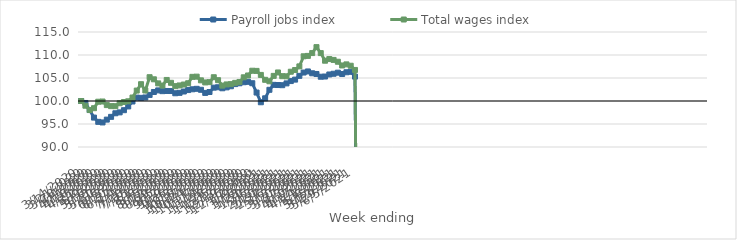
| Category | Payroll jobs index | Total wages index |
|---|---|---|
| 14/03/2020 | 100 | 100 |
| 21/03/2020 | 99.571 | 98.977 |
| 28/03/2020 | 98.032 | 98.042 |
| 04/04/2020 | 96.395 | 98.437 |
| 11/04/2020 | 95.466 | 99.841 |
| 18/04/2020 | 95.337 | 99.891 |
| 25/04/2020 | 95.953 | 99.109 |
| 02/05/2020 | 96.553 | 98.884 |
| 09/05/2020 | 97.332 | 98.873 |
| 16/05/2020 | 97.524 | 99.514 |
| 23/05/2020 | 98.001 | 99.779 |
| 30/05/2020 | 98.82 | 99.934 |
| 06/06/2020 | 99.892 | 100.753 |
| 13/06/2020 | 100.737 | 102.268 |
| 20/06/2020 | 100.685 | 103.652 |
| 27/06/2020 | 100.768 | 102.291 |
| 04/07/2020 | 101.321 | 105.174 |
| 11/07/2020 | 101.957 | 104.716 |
| 18/07/2020 | 102.306 | 103.83 |
| 25/07/2020 | 102.138 | 103.357 |
| 01/08/2020 | 102.18 | 104.576 |
| 08/08/2020 | 102.169 | 103.954 |
| 15/08/2020 | 101.684 | 103.229 |
| 22/08/2020 | 101.771 | 103.381 |
| 29/08/2020 | 102.063 | 103.578 |
| 05/09/2020 | 102.375 | 103.861 |
| 12/09/2020 | 102.547 | 105.249 |
| 19/09/2020 | 102.649 | 105.292 |
| 26/09/2020 | 102.437 | 104.492 |
| 03/10/2020 | 101.757 | 104.038 |
| 10/10/2020 | 101.956 | 104.103 |
| 17/10/2020 | 102.901 | 105.169 |
| 24/10/2020 | 102.989 | 104.528 |
| 31/10/2020 | 102.766 | 103.341 |
| 07/11/2020 | 102.962 | 103.604 |
| 14/11/2020 | 103.205 | 103.667 |
| 21/11/2020 | 103.673 | 103.947 |
| 28/11/2020 | 103.853 | 104.142 |
| 05/12/2020 | 104.081 | 105.153 |
| 12/12/2020 | 104.167 | 105.548 |
| 19/12/2020 | 103.864 | 106.581 |
| 26/12/2020 | 101.834 | 106.544 |
| 02/01/2021 | 99.728 | 105.672 |
| 09/01/2021 | 100.584 | 104.603 |
| 16/01/2021 | 102.435 | 104.285 |
| 23/01/2021 | 103.51 | 105.461 |
| 30/01/2021 | 103.472 | 106.204 |
| 06/02/2021 | 103.436 | 105.396 |
| 13/02/2021 | 103.825 | 105.366 |
| 20/02/2021 | 104.331 | 106.362 |
| 27/02/2021 | 104.648 | 106.73 |
| 06/03/2021 | 105.469 | 107.526 |
| 13/03/2021 | 106.189 | 109.719 |
| 20/03/2021 | 106.425 | 109.805 |
| 27/03/2021 | 106.026 | 110.42 |
| 03/04/2021 | 105.87 | 111.711 |
| 10/04/2021 | 105.276 | 110.412 |
| 17/04/2021 | 105.321 | 108.76 |
| 24/04/2021 | 105.768 | 109.119 |
| 01/05/2021 | 105.922 | 108.93 |
| 08/05/2021 | 106.157 | 108.535 |
| 15/05/2021 | 105.863 | 107.722 |
| 22/05/2021 | 106.249 | 107.962 |
| 29/05/2021 | 106.346 | 107.664 |
| 05/06/2021 | 105.306 | 106.751 |